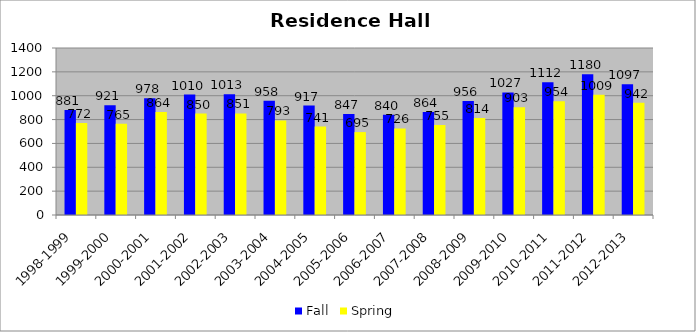
| Category | Fall | Spring |
|---|---|---|
| 1998-1999 | 881 | 772 |
| 1999-2000 | 921 | 765 |
| 2000-2001 | 978 | 864 |
| 2001-2002 | 1010 | 850 |
| 2002-2003 | 1013 | 851 |
| 2003-2004 | 958 | 793 |
| 2004-2005 | 917 | 741 |
| 2005-2006 | 847 | 695 |
| 2006-2007 | 840 | 726 |
| 2007-2008 | 864 | 755 |
| 2008-2009 | 956 | 814 |
| 2009-2010 | 1027 | 903 |
| 2010-2011 | 1112 | 954 |
| 2011-2012 | 1180 | 1009 |
| 2012-2013 | 1097 | 942 |